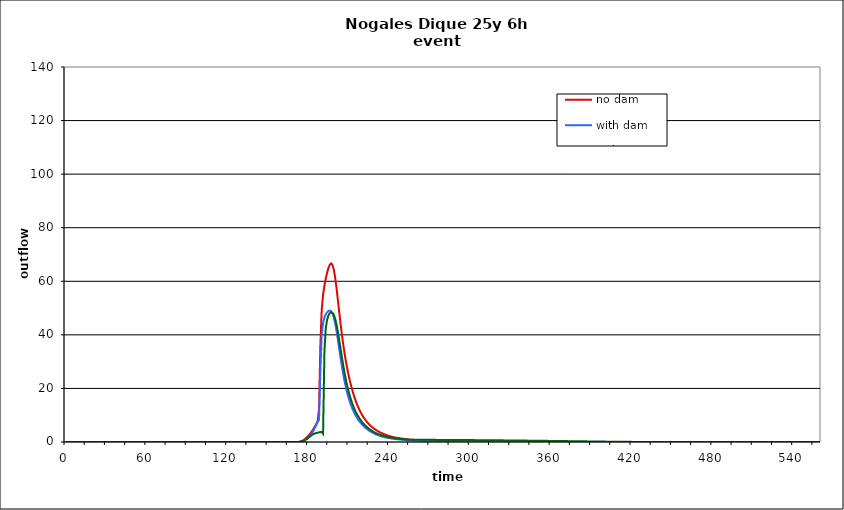
| Category | no dam | with dam | with dam/pond |
|---|---|---|---|
| 0.0 | 0 | 0 | 0 |
| 1.0 | 0 | 0 | 0 |
| 2.0 | 0 | 0 | 0 |
| 3.0 | 0 | 0 | 0 |
| 4.0 | 0 | 0 | 0 |
| 5.0 | 0 | 0 | 0 |
| 6.0 | 0 | 0 | 0 |
| 7.0 | 0 | 0 | 0 |
| 8.0 | 0 | 0 | 0 |
| 9.0 | 0 | 0 | 0 |
| 10.0 | 0 | 0 | 0 |
| 11.0 | 0 | 0 | 0 |
| 12.0 | 0 | 0 | 0 |
| 13.0 | 0 | 0 | 0 |
| 14.0 | 0 | 0 | 0 |
| 15.0 | 0 | 0 | 0 |
| 16.0 | 0 | 0 | 0 |
| 17.0 | 0 | 0 | 0 |
| 18.0 | 0 | 0 | 0 |
| 19.0 | 0 | 0 | 0 |
| 20.0 | 0 | 0 | 0 |
| 21.0 | 0 | 0 | 0 |
| 22.0 | 0 | 0 | 0 |
| 23.0 | 0 | 0 | 0 |
| 24.0 | 0 | 0 | 0 |
| 25.0 | 0 | 0 | 0 |
| 26.0 | 0 | 0 | 0 |
| 27.0 | 0 | 0 | 0 |
| 28.0 | 0 | 0 | 0 |
| 29.0 | 0 | 0 | 0 |
| 30.0 | 0 | 0 | 0 |
| 31.0 | 0 | 0 | 0 |
| 32.0 | 0 | 0 | 0 |
| 33.0 | 0 | 0 | 0 |
| 34.0 | 0 | 0 | 0 |
| 35.0 | 0 | 0 | 0 |
| 36.0 | 0 | 0 | 0 |
| 37.0 | 0 | 0 | 0 |
| 38.0 | 0 | 0 | 0 |
| 39.0 | 0 | 0 | 0 |
| 40.0 | 0 | 0 | 0 |
| 41.0 | 0 | 0 | 0 |
| 42.0 | 0 | 0 | 0 |
| 43.0 | 0 | 0 | 0 |
| 44.0 | 0 | 0 | 0 |
| 45.0 | 0 | 0 | 0 |
| 46.0 | 0 | 0 | 0 |
| 47.0 | 0 | 0 | 0 |
| 48.0 | 0 | 0 | 0 |
| 49.0 | 0 | 0 | 0 |
| 50.0 | 0 | 0 | 0 |
| 51.0 | 0 | 0 | 0 |
| 52.0 | 0 | 0 | 0 |
| 53.0 | 0 | 0 | 0 |
| 54.0 | 0 | 0 | 0 |
| 55.0 | 0 | 0 | 0 |
| 56.0 | 0 | 0 | 0 |
| 57.0 | 0 | 0 | 0 |
| 58.0 | 0 | 0 | 0 |
| 59.0 | 0 | 0 | 0 |
| 60.0 | 0 | 0 | 0 |
| 61.0 | 0 | 0 | 0 |
| 62.0 | 0 | 0 | 0 |
| 63.0 | 0 | 0 | 0 |
| 64.0 | 0 | 0 | 0 |
| 65.0 | 0 | 0 | 0 |
| 66.0 | 0 | 0 | 0 |
| 67.0 | 0 | 0 | 0 |
| 68.0 | 0 | 0 | 0 |
| 69.0 | 0 | 0 | 0 |
| 70.0 | 0 | 0 | 0 |
| 71.0 | 0 | 0 | 0 |
| 72.0 | 0 | 0 | 0 |
| 73.0 | 0 | 0 | 0 |
| 74.0 | 0 | 0 | 0 |
| 75.0 | 0 | 0 | 0 |
| 76.0 | 0 | 0 | 0 |
| 77.0 | 0 | 0 | 0 |
| 78.0 | 0 | 0 | 0 |
| 79.0 | 0 | 0 | 0 |
| 80.0 | 0 | 0 | 0 |
| 81.0 | 0 | 0 | 0 |
| 82.0 | 0 | 0 | 0 |
| 83.0 | 0 | 0 | 0 |
| 84.0 | 0 | 0 | 0 |
| 85.0 | 0 | 0 | 0 |
| 86.0 | 0 | 0 | 0 |
| 87.0 | 0 | 0 | 0 |
| 88.0 | 0 | 0 | 0 |
| 89.0 | 0 | 0 | 0 |
| 90.0 | 0 | 0 | 0 |
| 91.0 | 0 | 0 | 0 |
| 92.0 | 0 | 0 | 0 |
| 93.0 | 0 | 0 | 0 |
| 94.0 | 0 | 0 | 0 |
| 95.0 | 0 | 0 | 0 |
| 96.0 | 0 | 0 | 0 |
| 97.0 | 0 | 0 | 0 |
| 98.0 | 0 | 0 | 0 |
| 99.0 | 0 | 0 | 0 |
| 100.0 | 0 | 0 | 0 |
| 101.0 | 0 | 0 | 0 |
| 102.0 | 0 | 0 | 0 |
| 103.0 | 0 | 0 | 0 |
| 104.0 | 0 | 0 | 0 |
| 105.0 | 0 | 0 | 0 |
| 106.0 | 0 | 0 | 0 |
| 107.0 | 0 | 0 | 0 |
| 108.0 | 0 | 0 | 0 |
| 109.0 | 0 | 0 | 0 |
| 110.0 | 0 | 0 | 0 |
| 111.0 | 0 | 0 | 0 |
| 112.0 | 0 | 0 | 0 |
| 113.0 | 0 | 0 | 0 |
| 114.0 | 0 | 0 | 0 |
| 115.0 | 0 | 0 | 0 |
| 116.0 | 0 | 0 | 0 |
| 117.0 | 0 | 0 | 0 |
| 118.0 | 0 | 0 | 0 |
| 119.0 | 0 | 0 | 0 |
| 120.0 | 0 | 0 | 0 |
| 121.0 | 0 | 0 | 0 |
| 122.0 | 0 | 0 | 0 |
| 123.0 | 0 | 0 | 0 |
| 124.0 | 0 | 0 | 0 |
| 125.0 | 0 | 0 | 0 |
| 126.0 | 0 | 0 | 0 |
| 127.0 | 0 | 0 | 0 |
| 128.0 | 0 | 0 | 0 |
| 129.0 | 0 | 0 | 0 |
| 130.0 | 0 | 0 | 0 |
| 131.0 | 0 | 0 | 0 |
| 132.0 | 0 | 0 | 0 |
| 133.0 | 0 | 0 | 0 |
| 134.0 | 0 | 0 | 0 |
| 135.0 | 0 | 0 | 0 |
| 136.0 | 0 | 0 | 0 |
| 137.0 | 0 | 0 | 0 |
| 138.0 | 0 | 0 | 0 |
| 139.0 | 0 | 0 | 0 |
| 140.0 | 0 | 0 | 0 |
| 141.0 | 0 | 0 | 0 |
| 142.0 | 0 | 0 | 0 |
| 143.0 | 0 | 0 | 0 |
| 144.0 | 0 | 0 | 0 |
| 145.0 | 0 | 0 | 0 |
| 146.0 | 0 | 0 | 0 |
| 147.0 | 0 | 0 | 0 |
| 148.0 | 0 | 0 | 0 |
| 149.0 | 0 | 0 | 0 |
| 150.0 | 0 | 0 | 0 |
| 151.0 | 0 | 0 | 0 |
| 152.0 | 0 | 0 | 0 |
| 153.0 | 0 | 0 | 0 |
| 154.0 | 0 | 0 | 0 |
| 155.0 | 0 | 0 | 0 |
| 156.0 | 0 | 0 | 0 |
| 157.0 | 0 | 0 | 0 |
| 158.0 | 0 | 0 | 0 |
| 159.0 | 0 | 0 | 0 |
| 160.0 | 0 | 0 | 0 |
| 161.0 | 0 | 0 | 0 |
| 162.0 | 0 | 0 | 0 |
| 163.0 | 0 | 0 | 0 |
| 164.0 | 0 | 0 | 0 |
| 165.0 | 0 | 0 | 0 |
| 166.0 | 0 | 0 | 0 |
| 167.0 | 0 | 0 | 0 |
| 168.0 | 0 | 0 | 0 |
| 169.0 | 0.001 | 0 | 0 |
| 170.0 | 0.001 | 0 | 0 |
| 171.0 | 0.003 | 0.001 | 0.001 |
| 172.0 | 0.015 | 0.007 | 0.007 |
| 173.0 | 0.053 | 0.028 | 0.028 |
| 174.0 | 0.139 | 0.079 | 0.079 |
| 175.0 | 0.302 | 0.175 | 0.174 |
| 176.0 | 0.553 | 0.328 | 0.327 |
| 177.0 | 0.885 | 0.55 | 0.548 |
| 178.0 | 1.289 | 0.836 | 0.834 |
| 179.0 | 1.755 | 1.172 | 1.169 |
| 180.0 | 2.277 | 1.548 | 1.544 |
| 181.0 | 2.859 | 1.97 | 1.95 |
| 182.0 | 3.505 | 2.588 | 2.354 |
| 183.0 | 4.224 | 3.42 | 2.706 |
| 184.0 | 4.991 | 4.347 | 2.983 |
| 185.0 | 5.837 | 5.355 | 3.19 |
| 186.0 | 6.77 | 6.465 | 3.344 |
| 187.0 | 7.779 | 7.548 | 3.47 |
| 188.0 | 12.21 | 8.274 | 3.583 |
| 189.0 | 36.151 | 26.455 | 3.689 |
| 190.0 | 49.429 | 40.22 | 3.711 |
| 191.0 | 55.013 | 44.384 | 3.038 |
| 192.0 | 58.399 | 46.506 | 33.945 |
| 193.0 | 60.983 | 47.688 | 42.456 |
| 194.0 | 63.206 | 48.452 | 45.657 |
| 195.0 | 64.969 | 48.907 | 47.247 |
| 196.0 | 66.197 | 49.045 | 48.088 |
| 197.0 | 66.672 | 48.808 | 48.415 |
| 198.0 | 66.1 | 47.994 | 48.231 |
| 199.0 | 64.292 | 46.462 | 47.437 |
| 200.0 | 61.298 | 44.219 | 45.968 |
| 201.0 | 57.397 | 41.369 | 43.827 |
| 202.0 | 52.99 | 38.123 | 41.088 |
| 203.0 | 48.485 | 34.707 | 38.028 |
| 204.0 | 44.123 | 31.331 | 34.785 |
| 205.0 | 40.046 | 28.138 | 31.573 |
| 206.0 | 36.315 | 25.208 | 28.508 |
| 207.0 | 32.945 | 22.573 | 25.657 |
| 208.0 | 29.923 | 20.242 | 23.094 |
| 209.0 | 27.214 | 18.19 | 20.759 |
| 210.0 | 24.783 | 16.393 | 18.735 |
| 211.0 | 22.589 | 14.808 | 16.917 |
| 212.0 | 20.598 | 13.41 | 15.311 |
| 213.0 | 18.788 | 12.17 | 13.916 |
| 214.0 | 17.142 | 11.072 | 12.646 |
| 215.0 | 15.647 | 10.092 | 11.5 |
| 216.0 | 14.299 | 9.214 | 10.505 |
| 217.0 | 13.079 | 8.425 | 9.637 |
| 218.0 | 11.975 | 7.715 | 8.844 |
| 219.0 | 10.977 | 7.074 | 8.098 |
| 220.0 | 10.075 | 6.496 | 7.421 |
| 221.0 | 9.259 | 5.972 | 6.825 |
| 222.0 | 8.52 | 5.496 | 6.301 |
| 223.0 | 7.849 | 5.062 | 5.834 |
| 224.0 | 7.24 | 4.669 | 5.408 |
| 225.0 | 6.686 | 4.309 | 4.997 |
| 226.0 | 6.183 | 3.98 | 4.601 |
| 227.0 | 5.725 | 3.678 | 4.24 |
| 228.0 | 5.308 | 3.4 | 3.921 |
| 229.0 | 4.926 | 3.146 | 3.639 |
| 230.0 | 4.576 | 2.912 | 3.385 |
| 231.0 | 4.255 | 2.696 | 3.154 |
| 232.0 | 3.958 | 2.498 | 2.943 |
| 233.0 | 3.683 | 2.316 | 2.749 |
| 234.0 | 3.429 | 2.149 | 2.57 |
| 235.0 | 3.193 | 1.999 | 2.405 |
| 236.0 | 2.973 | 1.867 | 2.249 |
| 237.0 | 2.77 | 1.749 | 2.1 |
| 238.0 | 2.58 | 1.643 | 1.965 |
| 239.0 | 2.403 | 1.546 | 1.845 |
| 240.0 | 2.242 | 1.457 | 1.739 |
| 241.0 | 2.097 | 1.374 | 1.644 |
| 242.0 | 1.965 | 1.298 | 1.557 |
| 243.0 | 1.845 | 1.227 | 1.477 |
| 244.0 | 1.735 | 1.161 | 1.404 |
| 245.0 | 1.634 | 1.099 | 1.335 |
| 246.0 | 1.54 | 1.041 | 1.271 |
| 247.0 | 1.454 | 0.987 | 1.211 |
| 248.0 | 1.375 | 0.936 | 1.155 |
| 249.0 | 1.3 | 0.888 | 1.103 |
| 250.0 | 1.231 | 0.843 | 1.053 |
| 251.0 | 1.167 | 0.801 | 1.007 |
| 252.0 | 1.106 | 0.761 | 0.963 |
| 253.0 | 1.05 | 0.724 | 0.923 |
| 254.0 | 0.997 | 0.689 | 0.889 |
| 255.0 | 0.946 | 0.656 | 0.863 |
| 256.0 | 0.899 | 0.625 | 0.846 |
| 257.0 | 0.855 | 0.596 | 0.836 |
| 258.0 | 0.812 | 0.569 | 0.83 |
| 259.0 | 0.773 | 0.543 | 0.827 |
| 260.0 | 0.735 | 0.519 | 0.825 |
| 261.0 | 0.699 | 0.496 | 0.824 |
| 262.0 | 0.666 | 0.474 | 0.822 |
| 263.0 | 0.634 | 0.454 | 0.82 |
| 264.0 | 0.604 | 0.435 | 0.818 |
| 265.0 | 0.575 | 0.416 | 0.817 |
| 266.0 | 0.549 | 0.399 | 0.815 |
| 267.0 | 0.523 | 0.382 | 0.812 |
| 268.0 | 0.499 | 0.367 | 0.81 |
| 269.0 | 0.476 | 0.352 | 0.808 |
| 270.0 | 0.455 | 0.338 | 0.806 |
| 271.0 | 0.435 | 0.324 | 0.803 |
| 272.0 | 0.415 | 0.311 | 0.801 |
| 273.0 | 0.397 | 0.299 | 0.798 |
| 274.0 | 0.38 | 0.287 | 0.796 |
| 275.0 | 0.364 | 0.276 | 0.793 |
| 276.0 | 0.348 | 0.265 | 0.791 |
| 277.0 | 0.333 | 0.255 | 0.788 |
| 278.0 | 0.319 | 0.245 | 0.785 |
| 279.0 | 0.306 | 0.236 | 0.782 |
| 280.0 | 0.293 | 0.227 | 0.779 |
| 281.0 | 0.281 | 0.218 | 0.776 |
| 282.0 | 0.27 | 0.21 | 0.773 |
| 283.0 | 0.259 | 0.202 | 0.77 |
| 284.0 | 0.248 | 0.195 | 0.767 |
| 285.0 | 0.238 | 0.188 | 0.764 |
| 286.0 | 0.229 | 0.181 | 0.761 |
| 287.0 | 0.22 | 0.175 | 0.758 |
| 288.0 | 0.211 | 0.168 | 0.755 |
| 289.0 | 0.203 | 0.162 | 0.751 |
| 290.0 | 0.195 | 0.157 | 0.748 |
| 291.0 | 0.187 | 0.151 | 0.745 |
| 292.0 | 0.18 | 0.146 | 0.741 |
| 293.0 | 0.173 | 0.141 | 0.738 |
| 294.0 | 0.167 | 0.136 | 0.735 |
| 295.0 | 0.16 | 0.131 | 0.731 |
| 296.0 | 0.154 | 0.127 | 0.728 |
| 297.0 | 0.148 | 0.122 | 0.724 |
| 298.0 | 0.143 | 0.118 | 0.72 |
| 299.0 | 0.138 | 0.114 | 0.717 |
| 300.0 | 0.133 | 0.11 | 0.713 |
| 301.0 | 0.128 | 0.107 | 0.709 |
| 302.0 | 0.123 | 0.103 | 0.706 |
| 303.0 | 0.119 | 0.1 | 0.702 |
| 304.0 | 0.114 | 0.096 | 0.698 |
| 305.0 | 0.11 | 0.093 | 0.694 |
| 306.0 | 0.106 | 0.09 | 0.691 |
| 307.0 | 0.102 | 0.087 | 0.687 |
| 308.0 | 0.099 | 0.084 | 0.683 |
| 309.0 | 0.095 | 0.082 | 0.679 |
| 310.0 | 0.092 | 0.079 | 0.675 |
| 311.0 | 0.089 | 0.077 | 0.671 |
| 312.0 | 0.086 | 0.074 | 0.667 |
| 313.0 | 0.083 | 0.072 | 0.663 |
| 314.0 | 0.08 | 0.07 | 0.659 |
| 315.0 | 0.077 | 0.067 | 0.654 |
| 316.0 | 0.074 | 0.065 | 0.65 |
| 317.0 | 0.072 | 0.063 | 0.645 |
| 318.0 | 0.069 | 0.061 | 0.64 |
| 319.0 | 0.067 | 0.059 | 0.635 |
| 320.0 | 0.065 | 0.057 | 0.63 |
| 321.0 | 0.063 | 0.056 | 0.625 |
| 322.0 | 0.06 | 0.054 | 0.62 |
| 323.0 | 0.058 | 0.052 | 0.615 |
| 324.0 | 0.056 | 0.051 | 0.61 |
| 325.0 | 0.055 | 0.049 | 0.605 |
| 326.0 | 0.053 | 0.048 | 0.6 |
| 327.0 | 0.051 | 0.046 | 0.595 |
| 328.0 | 0.049 | 0.045 | 0.59 |
| 329.0 | 0.048 | 0.044 | 0.584 |
| 330.0 | 0.046 | 0.042 | 0.579 |
| 331.0 | 0.045 | 0.041 | 0.574 |
| 332.0 | 0.043 | 0.04 | 0.569 |
| 333.0 | 0.042 | 0.039 | 0.563 |
| 334.0 | 0.041 | 0.038 | 0.558 |
| 335.0 | 0.039 | 0.036 | 0.553 |
| 336.0 | 0.038 | 0.035 | 0.548 |
| 337.0 | 0.037 | 0.034 | 0.542 |
| 338.0 | 0.036 | 0.033 | 0.537 |
| 339.0 | 0.034 | 0.032 | 0.531 |
| 340.0 | 0.033 | 0.031 | 0.526 |
| 341.0 | 0.032 | 0.031 | 0.52 |
| 342.0 | 0.031 | 0.03 | 0.515 |
| 343.0 | 0.03 | 0.029 | 0.509 |
| 344.0 | 0.029 | 0.028 | 0.504 |
| 345.0 | 0.029 | 0.027 | 0.498 |
| 346.0 | 0.028 | 0.026 | 0.493 |
| 347.0 | 0.027 | 0.026 | 0.487 |
| 348.0 | 0.026 | 0.025 | 0.481 |
| 349.0 | 0.025 | 0.024 | 0.475 |
| 350.0 | 0.024 | 0.024 | 0.469 |
| 351.0 | 0.024 | 0.023 | 0.463 |
| 352.0 | 0.023 | 0.022 | 0.457 |
| 353.0 | 0.022 | 0.022 | 0.451 |
| 354.0 | 0.022 | 0.021 | 0.445 |
| 355.0 | 0.021 | 0.021 | 0.439 |
| 356.0 | 0.02 | 0.02 | 0.432 |
| 357.0 | 0.02 | 0.019 | 0.426 |
| 358.0 | 0.019 | 0.019 | 0.42 |
| 359.0 | 0.019 | 0.018 | 0.414 |
| 360.0 | 0.018 | 0.018 | 0.408 |
| 361.0 | 0.017 | 0.017 | 0.401 |
| 362.0 | 0.017 | 0.017 | 0.395 |
| 363.0 | 0.016 | 0.017 | 0.389 |
| 364.0 | 0.016 | 0.016 | 0.382 |
| 365.0 | 0.015 | 0.016 | 0.376 |
| 366.0 | 0.015 | 0.015 | 0.37 |
| 367.0 | 0.015 | 0.015 | 0.363 |
| 368.0 | 0.014 | 0.014 | 0.357 |
| 369.0 | 0.014 | 0.014 | 0.351 |
| 370.0 | 0.013 | 0.014 | 0.344 |
| 371.0 | 0.013 | 0.013 | 0.338 |
| 372.0 | 0.012 | 0.013 | 0.331 |
| 373.0 | 0.012 | 0.013 | 0.325 |
| 374.0 | 0.012 | 0.012 | 0.319 |
| 375.0 | 0.011 | 0.012 | 0.312 |
| 376.0 | 0.011 | 0.012 | 0.305 |
| 377.0 | 0.01 | 0.011 | 0.299 |
| 378.0 | 0.01 | 0.011 | 0.292 |
| 379.0 | 0.01 | 0.011 | 0.285 |
| 380.0 | 0.009 | 0.01 | 0.278 |
| 381.0 | 0.009 | 0.01 | 0.271 |
| 382.0 | 0.009 | 0.01 | 0.264 |
| 383.0 | 0.008 | 0.009 | 0.257 |
| 384.0 | 0.008 | 0.009 | 0.251 |
| 385.0 | 0.008 | 0.009 | 0.244 |
| 386.0 | 0.007 | 0.009 | 0.237 |
| 387.0 | 0.007 | 0.008 | 0.23 |
| 388.0 | 0.007 | 0.008 | 0.224 |
| 389.0 | 0.006 | 0.008 | 0.217 |
| 390.0 | 0.006 | 0.007 | 0.211 |
| 391.0 | 0.006 | 0.007 | 0.204 |
| 392.0 | 0.005 | 0.007 | 0.198 |
| 393.0 | 0.005 | 0.007 | 0.191 |
| 394.0 | 0.005 | 0.006 | 0.185 |
| 395.0 | 0.005 | 0.006 | 0.178 |
| 396.0 | 0.004 | 0.006 | 0.172 |
| 397.0 | 0.004 | 0.006 | 0.165 |
| 398.0 | 0.004 | 0.006 | 0.159 |
| 399.0 | 0.004 | 0.005 | 0.152 |
| 400.0 | 0.003 | 0.005 | 0.145 |
| 401.0 | 0.003 | 0.005 | 0.138 |
| 402.0 | 0.003 | 0.005 | 0.131 |
| 403.0 | 0.003 | 0.004 | 0.124 |
| 404.0 | 0.003 | 0.004 | 0.117 |
| 405.0 | 0.002 | 0.004 | 0.11 |
| 406.0 | 0.002 | 0.004 | 0.104 |
| 407.0 | 0.002 | 0.004 | 0.098 |
| 408.0 | 0.002 | 0.004 | 0.092 |
| 409.0 | 0.002 | 0.003 | 0.087 |
| 410.0 | 0.002 | 0.003 | 0.082 |
| 411.0 | 0.001 | 0.003 | 0.077 |
| 412.0 | 0.001 | 0.003 | 0.072 |
| 413.0 | 0.001 | 0.003 | 0.068 |
| 414.0 | 0.001 | 0.002 | 0.064 |
| 415.0 | 0.001 | 0.002 | 0.061 |
| 416.0 | 0.001 | 0.002 | 0.057 |
| 417.0 | 0.001 | 0.002 | 0.054 |
| 418.0 | 0.001 | 0.002 | 0.051 |
| 419.0 | 0.001 | 0.002 | 0.048 |
| 420.0 | 0.001 | 0.002 | 0.045 |
| 421.0 | 0.001 | 0.001 | 0.043 |
| 422.0 | 0 | 0.001 | 0.041 |
| 423.0 | 0 | 0.001 | 0.038 |
| 424.0 | 0 | 0.001 | 0.036 |
| 425.0 | 0 | 0.001 | 0.034 |
| 426.0 | 0 | 0.001 | 0.033 |
| 427.0 | 0 | 0.001 | 0.031 |
| 428.0 | 0 | 0.001 | 0.029 |
| 429.0 | 0 | 0.001 | 0.028 |
| 430.0 | 0 | 0.001 | 0.026 |
| 431.0 | 0 | 0.001 | 0.025 |
| 432.0 | 0 | 0.001 | 0.024 |
| 433.0 | 0 | 0.001 | 0.023 |
| 434.0 | 0 | 0 | 0.022 |
| 435.0 | 0 | 0 | 0.02 |
| 436.0 | 0 | 0 | 0.02 |
| 437.0 | 0 | 0 | 0.019 |
| 438.0 | 0 | 0 | 0.018 |
| 439.0 | 0 | 0 | 0.017 |
| 440.0 | 0 | 0 | 0.016 |
| 441.0 | 0 | 0 | 0.015 |
| 442.0 | 0 | 0 | 0.015 |
| 443.0 | 0 | 0 | 0.014 |
| 444.0 | 0 | 0 | 0.013 |
| 445.0 | 0 | 0 | 0.013 |
| 446.0 | 0 | 0 | 0.012 |
| 447.0 | 0 | 0 | 0.011 |
| 448.0 | 0 | 0 | 0.011 |
| 449.0 | 0 | 0 | 0.01 |
| 450.0 | 0 | 0 | 0.01 |
| 451.0 | 0 | 0 | 0.009 |
| 452.0 | 0 | 0 | 0.009 |
| 453.0 | 0 | 0 | 0.008 |
| 454.0 | 0 | 0 | 0.008 |
| 455.0 | 0 | 0 | 0.007 |
| 456.0 | 0 | 0 | 0.007 |
| 457.0 | 0 | 0 | 0.007 |
| 458.0 | 0 | 0 | 0.006 |
| 459.0 | 0 | 0 | 0.006 |
| 460.0 | 0 | 0 | 0.005 |
| 461.0 | 0 | 0 | 0.005 |
| 462.0 | 0 | 0 | 0.005 |
| 463.0 | 0 | 0 | 0.004 |
| 464.0 | 0 | 0 | 0.004 |
| 465.0 | 0 | 0 | 0.004 |
| 466.0 | 0 | 0 | 0.003 |
| 467.0 | 0 | 0 | 0.003 |
| 468.0 | 0 | 0 | 0.003 |
| 469.0 | 0 | 0 | 0.003 |
| 470.0 | 0 | 0 | 0.002 |
| 471.0 | 0 | 0 | 0.002 |
| 472.0 | 0 | 0 | 0.002 |
| 473.0 | 0 | 0 | 0.002 |
| 474.0 | 0 | 0 | 0.002 |
| 475.0 | 0 | 0 | 0.002 |
| 476.0 | 0 | 0 | 0.001 |
| 477.0 | 0 | 0 | 0.001 |
| 478.0 | 0 | 0 | 0.001 |
| 479.0 | 0 | 0 | 0.001 |
| 480.0 | 0 | 0 | 0.001 |
| 481.0 | 0 | 0 | 0.001 |
| 482.0 | 0 | 0 | 0.001 |
| 483.0 | 0 | 0 | 0.001 |
| 484.0 | 0 | 0 | 0.001 |
| 485.0 | 0 | 0 | 0 |
| 486.0 | 0 | 0 | 0 |
| 487.0 | 0 | 0 | 0 |
| 488.0 | 0 | 0 | 0 |
| 489.0 | 0 | 0 | 0 |
| 490.0 | 0 | 0 | 0 |
| 491.0 | 0 | 0 | 0 |
| 492.0 | 0 | 0 | 0 |
| 493.0 | 0 | 0 | 0 |
| 494.0 | 0 | 0 | 0 |
| 495.0 | 0 | 0 | 0 |
| 496.0 | 0 | 0 | 0 |
| 497.0 | 0 | 0 | 0 |
| 498.0 | 0 | 0 | 0 |
| 499.0 | 0 | 0 | 0 |
| 500.0 | 0 | 0 | 0 |
| 501.0 | 0 | 0 | 0 |
| 502.0 | 0 | 0 | 0 |
| 503.0 | 0 | 0 | 0 |
| 504.0 | 0 | 0 | 0 |
| 505.0 | 0 | 0 | 0 |
| 506.0 | 0 | 0 | 0 |
| 507.0 | 0 | 0 | 0 |
| 508.0 | 0 | 0 | 0 |
| 509.0 | 0 | 0 | 0 |
| 510.0 | 0 | 0 | 0 |
| 511.0 | 0 | 0 | 0 |
| 512.0 | 0 | 0 | 0 |
| 513.0 | 0 | 0 | 0 |
| 514.0 | 0 | 0 | 0 |
| 515.0 | 0 | 0 | 0 |
| 516.0 | 0 | 0 | 0 |
| 517.0 | 0 | 0 | 0 |
| 518.0 | 0 | 0 | 0 |
| 519.0 | 0 | 0 | 0 |
| 520.0 | 0 | 0 | 0 |
| 521.0 | 0 | 0 | 0 |
| 522.0 | 0 | 0 | 0 |
| 523.0 | 0 | 0 | 0 |
| 524.0 | 0 | 0 | 0 |
| 525.0 | 0 | 0 | 0 |
| 526.0 | 0 | 0 | 0 |
| 527.0 | 0 | 0 | 0 |
| 528.0 | 0 | 0 | 0 |
| 529.0 | 0 | 0 | 0 |
| 530.0 | 0 | 0 | 0 |
| 531.0 | 0 | 0 | 0 |
| 532.0 | 0 | 0 | 0 |
| 533.0 | 0 | 0 | 0 |
| 534.0 | 0 | 0 | 0 |
| 535.0 | 0 | 0 | 0 |
| 536.0 | 0 | 0 | 0 |
| 537.0 | 0 | 0 | 0 |
| 538.0 | 0 | 0 | 0 |
| 539.0 | 0 | 0 | 0 |
| 540.0 | 0 | 0 | 0 |
| 541.0 | 0 | 0 | 0 |
| 542.0 | 0 | 0 | 0 |
| 543.0 | 0 | 0 | 0 |
| 544.0 | 0 | 0 | 0 |
| 545.0 | 0 | 0 | 0 |
| 546.0 | 0 | 0 | 0 |
| 547.0 | 0 | 0 | 0 |
| 548.0 | 0 | 0 | 0 |
| 549.0 | 0 | 0 | 0 |
| 550.0 | 0 | 0 | 0 |
| 551.0 | 0 | 0 | 0 |
| 552.0 | 0 | 0 | 0 |
| 553.0 | 0 | 0 | 0 |
| 554.0 | 0 | 0 | 0 |
| 555.0 | 0 | 0 | 0 |
| 556.0 | 0 | 0 | 0 |
| 557.0 | 0 | 0 | 0 |
| 558.0 | 0 | 0 | 0 |
| 559.0 | 0 | 0 | 0 |
| 560.0 | 0 | 0 | 0 |